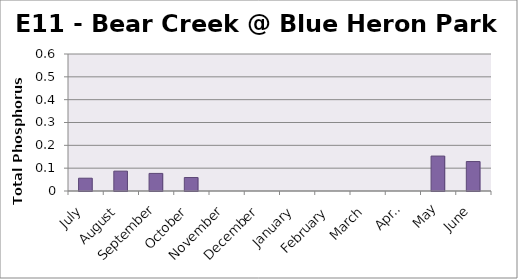
| Category | Phosphorus (mg/L) |
|---|---|
| July | 0.056 |
| August | 0.087 |
| September | 0.077 |
| October | 0.059 |
| November | 0 |
| December | 0 |
| January | 0 |
| February | 0 |
| March | 0 |
| April | 0 |
| May | 0.153 |
| June | 0.129 |